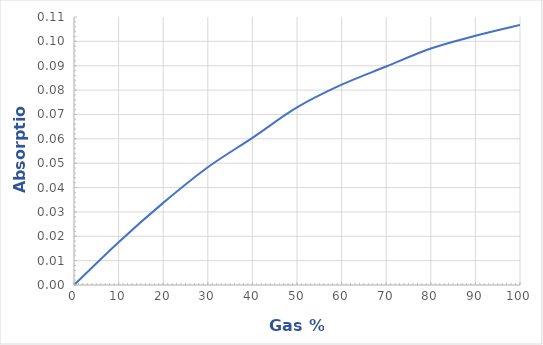
| Category | Series 0 |
|---|---|
| 0.0 | 0 |
| 10.0 | 0.018 |
| 20.0 | 0.034 |
| 30.0 | 0.048 |
| 40.0 | 0.06 |
| 50.0 | 0.073 |
| 60.0 | 0.082 |
| 70.0 | 0.09 |
| 80.0 | 0.097 |
| 90.0 | 0.102 |
| 100.0 | 0.107 |